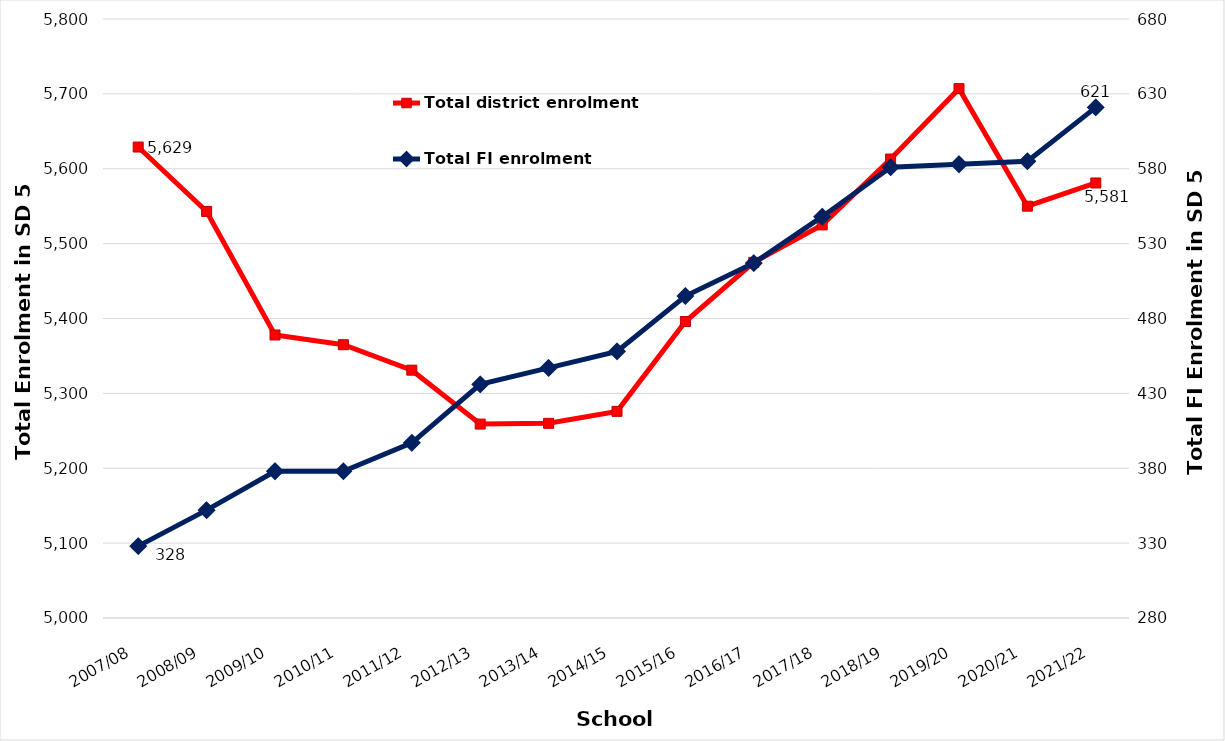
| Category | Total district enrolment  |
|---|---|
| 2007/08 | 5629 |
| 2008/09 | 5543 |
| 2009/10 | 5378 |
| 2010/11 | 5365 |
| 2011/12 | 5331 |
| 2012/13 | 5259 |
| 2013/14 | 5260 |
| 2014/15 | 5276 |
| 2015/16 | 5396 |
| 2016/17 | 5475 |
| 2017/18 | 5525 |
| 2018/19 | 5613 |
| 2019/20 | 5707 |
| 2020/21 | 5550 |
| 2021/22 | 5581 |